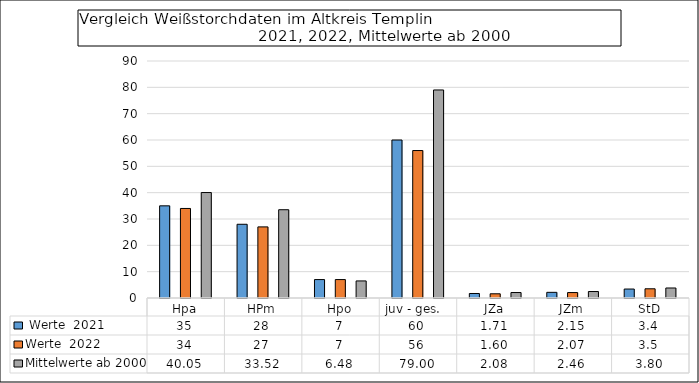
| Category |  Werte  2021 | Werte  2022 | Mittelwerte ab 2000 |
|---|---|---|---|
| Hpa | 35 | 34 | 40.05 |
| HPm | 28 | 27 | 33.52 |
| Hpo | 7 | 7 | 6.48 |
| juv - ges.   | 60 | 56 | 79 |
| JZa | 1.71 | 1.6 | 2.08 |
| JZm | 2.15 | 2.07 | 2.46 |
| StD | 3.4 | 3.5 | 3.8 |